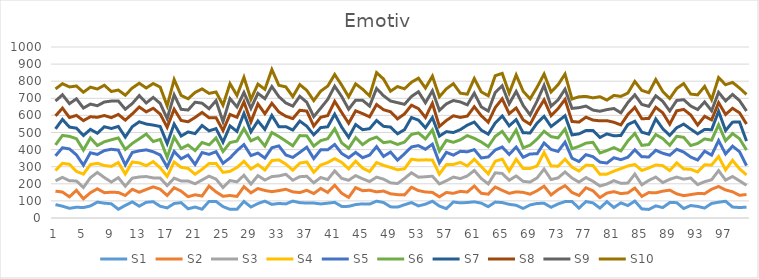
| Category | S1 | S2 | S3 | S4 | S5 | S6 | S7 | S8 | S9 | S10 |
|---|---|---|---|---|---|---|---|---|---|---|
| 0 | 78.467 | 78.527 | 60.612 | 60.177 | 85.611 | 63.74 | 93.986 | 75.898 | 87.042 | 70.697 |
| 1 | 69.061 | 82.87 | 85.747 | 82.359 | 90.784 | 72.009 | 93.649 | 66 | 78.191 | 64.788 |
| 2 | 56.601 | 67.165 | 93.587 | 96.684 | 89.911 | 73.681 | 53.923 | 55.965 | 81.221 | 97.738 |
| 3 | 63.145 | 98.703 | 55.097 | 55.909 | 96.347 | 94.662 | 61.629 | 74.495 | 96.851 | 75.119 |
| 4 | 60.925 | 51.607 | 65.849 | 78.228 | 52.152 | 88.231 | 85.349 | 87.175 | 73.401 | 92.709 |
| 5 | 70.544 | 77.129 | 88.09 | 76.564 | 69.221 | 86.278 | 50.427 | 73.833 | 73.99 | 99.155 |
| 6 | 92.777 | 78.067 | 95.609 | 53.538 | 51.758 | 52.041 | 71.859 | 93.385 | 67.588 | 97.686 |
| 7 | 86.822 | 61.195 | 88.634 | 70.014 | 87.556 | 51.54 | 87.857 | 65.707 | 78.903 | 98.064 |
| 8 | 83.096 | 67.919 | 59.258 | 91.692 | 99.935 | 55.556 | 65.9 | 63.522 | 97.004 | 55.79 |
| 9 | 51.124 | 98.163 | 86.533 | 88.343 | 73.125 | 70.9 | 67.236 | 70.317 | 78.59 | 64.001 |
| 10 | 73.673 | 58.167 | 54.343 | 71.137 | 53.494 | 90.167 | 72.31 | 99.115 | 63.763 | 82.103 |
| 11 | 94.358 | 73.394 | 65.268 | 94.496 | 55.771 | 52.642 | 98.208 | 74.675 | 60.477 | 90.666 |
| 12 | 69.001 | 81.5 | 89.519 | 82.307 | 70.454 | 70.161 | 99.501 | 86.967 | 66.619 | 72.032 |
| 13 | 91.826 | 74.93 | 75.639 | 63.642 | 92.407 | 92.549 | 58.647 | 71.252 | 51.93 | 87.446 |
| 14 | 95.3 | 86.695 | 52.432 | 95.305 | 57.615 | 59.662 | 96.39 | 98.263 | 63.426 | 81.272 |
| 15 | 68.653 | 99.585 | 65.493 | 59.905 | 75.058 | 91.205 | 75.294 | 72.502 | 62.355 | 95.328 |
| 16 | 59.047 | 72.782 | 57.452 | 54.18 | 54.665 | 56.493 | 80.768 | 95.2 | 50.508 | 74.71 |
| 17 | 84.778 | 92.304 | 55.841 | 94.23 | 61.949 | 84.024 | 76.225 | 86.961 | 83.923 | 89.364 |
| 18 | 89.714 | 67.205 | 59.517 | 79.779 | 50.141 | 60.301 | 72.554 | 91.194 | 65.165 | 81.132 |
| 19 | 53.852 | 70.735 | 91.819 | 73.419 | 77.946 | 58.771 | 76.717 | 59.457 | 68.763 | 65.731 |
| 20 | 64.058 | 71.698 | 64.337 | 55.804 | 57.405 | 80.844 | 99.388 | 94.567 | 89.046 | 57.301 |
| 21 | 51.473 | 76.957 | 94.039 | 62.131 | 97.997 | 59.179 | 99.182 | 76.508 | 53.974 | 83.605 |
| 22 | 97.016 | 89.624 | 58.211 | 73.706 | 53.636 | 55.681 | 81.683 | 76.507 | 52.767 | 89.827 |
| 23 | 97.078 | 55.728 | 74.637 | 91.991 | 68.401 | 80.463 | 54.455 | 63.994 | 99.613 | 50.567 |
| 24 | 66.538 | 60.514 | 50.918 | 88.863 | 53.079 | 68.724 | 54.941 | 67.933 | 51.859 | 96.608 |
| 25 | 50.81 | 80.819 | 87.321 | 54.053 | 78.043 | 89.924 | 97.53 | 66.966 | 92.705 | 87.48 |
| 26 | 50.84 | 75.281 | 85.328 | 83.652 | 98.785 | 56.123 | 56.312 | 82.852 | 60.501 | 67.348 |
| 27 | 96.973 | 86.167 | 66.433 | 82.166 | 97.476 | 93.949 | 88.117 | 67.771 | 54.681 | 88.863 |
| 28 | 64.108 | 83.023 | 51.246 | 87.787 | 78.795 | 85.849 | 53.022 | 58.774 | 78.717 | 52.996 |
| 29 | 84.578 | 87.75 | 75.469 | 64.59 | 67.387 | 90.535 | 97.261 | 99.555 | 61.858 | 54.003 |
| 30 | 98.396 | 62.456 | 60.992 | 58.919 | 69.684 | 70.603 | 96.761 | 91.85 | 88.142 | 54.732 |
| 31 | 79.627 | 74.324 | 88.392 | 93.47 | 75.024 | 89.09 | 99.689 | 70.954 | 98.101 | 99.643 |
| 32 | 85.13 | 74.95 | 85.878 | 93.994 | 81.768 | 54.79 | 57.323 | 86.48 | 89.757 | 65.834 |
| 33 | 82.342 | 85.75 | 87.62 | 59.318 | 53.57 | 81.311 | 84.249 | 60.804 | 77.881 | 93.821 |
| 34 | 98.814 | 54.101 | 68.003 | 58.726 | 74.751 | 67.733 | 92.276 | 66.794 | 72.896 | 55.7 |
| 35 | 89.646 | 58.954 | 92.83 | 79.49 | 62.746 | 98.304 | 84.855 | 63.105 | 81.608 | 68.531 |
| 36 | 87.339 | 74.755 | 81.934 | 83.933 | 86.245 | 66 | 56.611 | 88.539 | 51.526 | 69.648 |
| 37 | 87.386 | 55.564 | 63.028 | 61.569 | 79.933 | 72.967 | 65.921 | 51.27 | 55.474 | 93.516 |
| 38 | 82.233 | 90.395 | 64.106 | 72.828 | 89.408 | 53.461 | 76.199 | 60.441 | 53.426 | 99.488 |
| 39 | 86.634 | 62.95 | 75.045 | 99.726 | 74.511 | 64.683 | 69.681 | 65.594 | 94.5 | 77.992 |
| 40 | 91.491 | 99.905 | 83.889 | 71.672 | 82.796 | 91.721 | 85.656 | 75.048 | 88.57 | 68.347 |
| 41 | 67.775 | 77.006 | 86.986 | 93.763 | 51.856 | 62.165 | 91.843 | 85.772 | 93.027 | 66.769 |
| 42 | 68.016 | 52.505 | 99.968 | 66.914 | 64.867 | 55.094 | 64.261 | 82.484 | 82.075 | 72.254 |
| 43 | 78.544 | 99.209 | 69.961 | 84.791 | 51.287 | 85.713 | 76.942 | 80.243 | 62.34 | 95.093 |
| 44 | 82.67 | 77.033 | 69.614 | 62.36 | 61.019 | 76.626 | 87.101 | 94.221 | 77.664 | 64.976 |
| 45 | 81.204 | 81.205 | 50.788 | 58.245 | 96.491 | 90.41 | 63.833 | 69.41 | 62.654 | 60.005 |
| 46 | 98.527 | 54.227 | 86.174 | 85.176 | 93.229 | 55.862 | 96.85 | 93.468 | 94.052 | 92.468 |
| 47 | 90.596 | 67.021 | 69.6 | 80.838 | 52.076 | 80.605 | 95.461 | 96.96 | 81.776 | 97.699 |
| 48 | 65.249 | 76.31 | 64.15 | 89.805 | 90.053 | 61.049 | 85.116 | 89.535 | 62.914 | 57.27 |
| 49 | 63.73 | 72.971 | 64.651 | 80.642 | 56.508 | 91.632 | 62.124 | 87.25 | 95.05 | 94.181 |
| 50 | 77.488 | 57.567 | 96.362 | 56.285 | 87.65 | 68.499 | 72.651 | 92.178 | 56.061 | 90.746 |
| 51 | 90.321 | 89.558 | 84.546 | 79.356 | 71.844 | 73.224 | 98.602 | 72.085 | 51.238 | 83.137 |
| 52 | 70.605 | 89.575 | 78.524 | 99.436 | 85.273 | 74.145 | 74.911 | 67.216 | 98.615 | 79.251 |
| 53 | 80.837 | 71.385 | 88.963 | 98.823 | 62.128 | 60.519 | 64.776 | 60.609 | 85.872 | 85.971 |
| 54 | 98.107 | 51.415 | 95.02 | 95.032 | 91.727 | 84.244 | 71.909 | 83.15 | 73.284 | 85.559 |
| 55 | 69.815 | 54.036 | 75.497 | 57.487 | 65.854 | 68.9 | 87.268 | 56.623 | 94.071 | 79.393 |
| 56 | 54.685 | 94.74 | 68.474 | 94.202 | 72.06 | 70.253 | 50.633 | 65.283 | 97.263 | 87.789 |
| 57 | 93.54 | 50.685 | 94.97 | 73.942 | 54.493 | 74.872 | 57.38 | 97.715 | 89.556 | 98.412 |
| 58 | 88.374 | 67.484 | 74.435 | 94.886 | 64.739 | 67.319 | 59.582 | 71.436 | 90.451 | 51.322 |
| 59 | 90.561 | 61.113 | 94.246 | 58.627 | 82.681 | 94.548 | 61.283 | 52.63 | 66.126 | 62.171 |
| 60 | 94.557 | 92.22 | 91.33 | 65.537 | 56.215 | 66.051 | 95.051 | 89.633 | 79.335 | 85.74 |
| 61 | 86.902 | 57.244 | 86.895 | 69.862 | 50.143 | 93.596 | 68.996 | 84.575 | 51.439 | 88.06 |
| 62 | 66.409 | 73.113 | 59.989 | 58.52 | 99.299 | 59.928 | 73.041 | 69.771 | 65.448 | 89.195 |
| 63 | 93.125 | 88.093 | 82.765 | 67.835 | 65.92 | 79.519 | 78.651 | 89.883 | 88.371 | 97.744 |
| 64 | 90.259 | 71.474 | 98.918 | 83.636 | 70.886 | 91.55 | 90.195 | 99.839 | 76.482 | 72.628 |
| 65 | 79.974 | 64.084 | 76.724 | 54.792 | 96.148 | 77.876 | 89.478 | 70.953 | 57.534 | 62.9 |
| 66 | 74.532 | 78.401 | 92.975 | 97.366 | 71.79 | 99.566 | 60.767 | 67.941 | 96.674 | 96.35 |
| 67 | 56.002 | 93.843 | 64.52 | 75.473 | 65.086 | 55.292 | 87.748 | 75.785 | 84.316 | 83.061 |
| 68 | 76.393 | 63.052 | 70.811 | 79.398 | 85.149 | 51.169 | 71.705 | 50.385 | 54.775 | 93.886 |
| 69 | 85.155 | 74.414 | 74.968 | 69.699 | 71.005 | 86.351 | 93.356 | 69.412 | 59.55 | 81.125 |
| 70 | 86.108 | 99.843 | 99.99 | 97.368 | 55.505 | 68.443 | 87.382 | 96.318 | 84.965 | 65.897 |
| 71 | 62.691 | 72.189 | 90.181 | 79.012 | 96.933 | 74.956 | 58.808 | 64.022 | 54.764 | 83.404 |
| 72 | 82.216 | 83.616 | 68.575 | 68.637 | 86.275 | 79 | 97.829 | 73.303 | 51.181 | 88.51 |
| 73 | 96.015 | 92.971 | 80.215 | 75.146 | 99.52 | 76.488 | 77.645 | 95.342 | 59.937 | 88.196 |
| 74 | 96.121 | 53.356 | 84.177 | 63.789 | 52.014 | 55.645 | 80.867 | 78.566 | 76.463 | 54.784 |
| 75 | 57.587 | 74.009 | 78.193 | 64.877 | 55.56 | 88.739 | 73.028 | 68.705 | 84.476 | 63.67 |
| 76 | 96.317 | 80.434 | 59.825 | 72.11 | 61.733 | 67.278 | 73.939 | 77.923 | 64.901 | 56.741 |
| 77 | 88.331 | 70.983 | 55.524 | 92.147 | 51.59 | 84.187 | 69.361 | 60.528 | 58.459 | 71.439 |
| 78 | 57.915 | 61.612 | 67.499 | 68.317 | 71.516 | 53.285 | 90.957 | 96.962 | 56.234 | 84.93 |
| 79 | 95.589 | 50.143 | 52.975 | 57.72 | 64.849 | 73.202 | 97.333 | 77.289 | 64.778 | 55.713 |
| 80 | 61.111 | 93 | 64.34 | 55.558 | 78.396 | 59.074 | 69.095 | 79.28 | 80.446 | 76.609 |
| 81 | 88.269 | 54.396 | 60.074 | 86.045 | 52.279 | 51.153 | 90.506 | 61.691 | 70.704 | 95.971 |
| 82 | 72.814 | 74.1 | 57.367 | 99.898 | 51.063 | 95.174 | 95.869 | 58.866 | 69.946 | 55.61 |
| 83 | 98.836 | 76.121 | 81.814 | 56.241 | 85.744 | 95.873 | 70.919 | 81.881 | 73.17 | 77.972 |
| 84 | 53.214 | 73.204 | 67.713 | 83.832 | 79.968 | 66.82 | 77.012 | 78.854 | 83.529 | 81.934 |
| 85 | 50.143 | 98.672 | 71.169 | 72.493 | 64.64 | 72.48 | 60.773 | 91.364 | 71.266 | 79.685 |
| 86 | 70.835 | 76.228 | 92.251 | 70.987 | 85.731 | 91.957 | 91.461 | 67.855 | 67.521 | 94.574 |
| 87 | 61.027 | 95.809 | 50.367 | 99.084 | 72.312 | 86.283 | 57.301 | 92.956 | 67.343 | 57.803 |
| 88 | 90.021 | 72.871 | 63.349 | 51.096 | 89.757 | 58.062 | 58 | 65.801 | 77.153 | 72.81 |
| 89 | 89.871 | 51.365 | 97.979 | 83.182 | 79.618 | 75.798 | 50.125 | 99.065 | 60.22 | 70.139 |
| 90 | 55.4 | 75.204 | 96.589 | 59.723 | 98.69 | 86.27 | 77.096 | 86.097 | 56.945 | 94.213 |
| 91 | 72.947 | 63.746 | 97.352 | 50.59 | 71.957 | 67.148 | 96.265 | 83.046 | 52.101 | 69.688 |
| 92 | 67.729 | 75.612 | 52.14 | 73.536 | 70.1 | 96.918 | 56.135 | 51.422 | 90.591 | 85.996 |
| 93 | 58.142 | 84.182 | 69.948 | 98.685 | 79.818 | 71.733 | 55.515 | 76.683 | 83.942 | 90.804 |
| 94 | 85.247 | 82.836 | 55.701 | 86.426 | 57.376 | 87.482 | 61.155 | 57.455 | 53.377 | 65.146 |
| 95 | 92.228 | 92.239 | 92.572 | 82.127 | 93.559 | 92.027 | 79.19 | 50.362 | 60.611 | 85.804 |
| 96 | 98.037 | 66.13 | 57.771 | 59.928 | 92.663 | 77.021 | 60.094 | 93.895 | 79.396 | 94.474 |
| 97 | 64.111 | 89.312 | 89.108 | 94.777 | 82.928 | 73.696 | 66.614 | 80.948 | 81.042 | 70.394 |
| 98 | 61.128 | 71.465 | 84.949 | 70.197 | 99.822 | 76.029 | 97.959 | 53.681 | 71.506 | 73.276 |
| 99 | 63.489 | 74.032 | 53.756 | 60.31 | 54.458 | 91.447 | 52.421 | 99.449 | 76.375 | 96.76 |